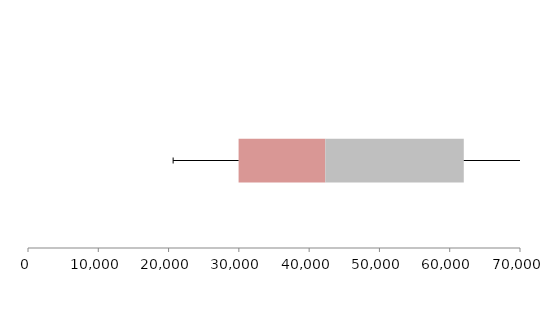
| Category | Series 1 | Series 2 | Series 3 |
|---|---|---|---|
| 0 | 29962.513 | 12339.507 | 19700.12 |